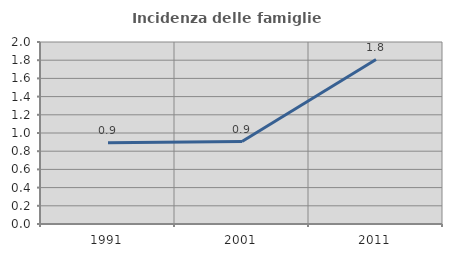
| Category | Incidenza delle famiglie numerose |
|---|---|
| 1991.0 | 0.893 |
| 2001.0 | 0.906 |
| 2011.0 | 1.807 |